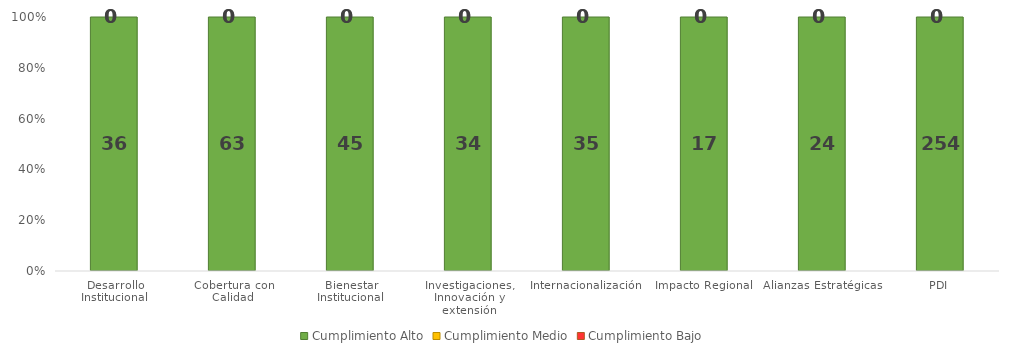
| Category | Cumplimiento Alto | Cumplimiento Medio | Cumplimiento Bajo |
|---|---|---|---|
| Desarrollo Institucional | 36 | 0 | 0 |
| Cobertura con Calidad | 63 | 0 | 0 |
| Bienestar Institucional | 45 | 0 | 0 |
| Investigaciones, Innovación y extensión | 34 | 0 | 0 |
| Internacionalización | 35 | 0 | 0 |
| Impacto Regional | 17 | 0 | 0 |
| Alianzas Estratégicas | 24 | 0 | 0 |
| PDI | 254 | 0 | 0 |